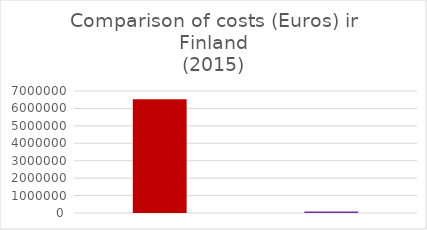
| Category | Finland |
|---|---|
| 0 | 6520000 |
| 1 | 85726 |